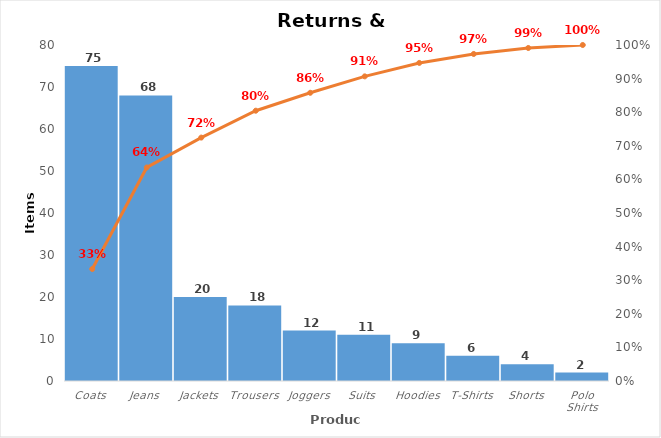
| Category | Items Returned |
|---|---|
| Coats | 75 |
| Jeans | 68 |
| Jackets | 20 |
| Trousers | 18 |
| Joggers | 12 |
| Suits | 11 |
| Hoodies | 9 |
| T-Shirts | 6 |
| Shorts | 4 |
| Polo Shirts | 2 |